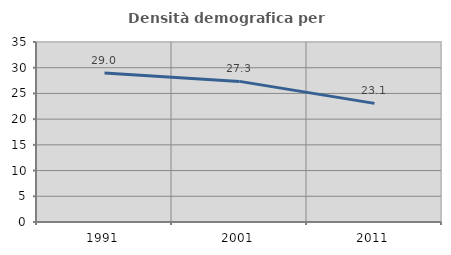
| Category | Densità demografica |
|---|---|
| 1991.0 | 28.978 |
| 2001.0 | 27.342 |
| 2011.0 | 23.07 |